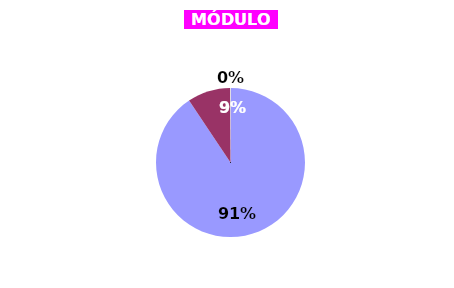
| Category | Series 1 | Series 0 |
|---|---|---|
| ÓTIMO | 1767 | 73.886 |
| BOM | 181 | 23.93 |
| REGULAR | 2 | 2.134 |